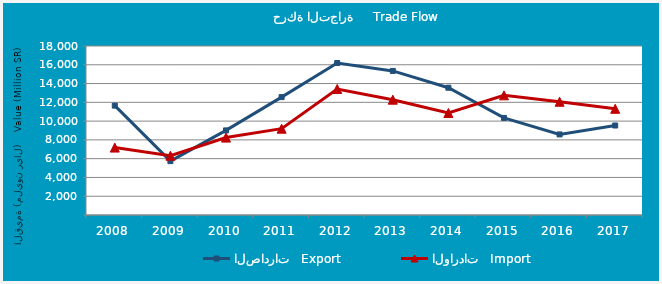
| Category | الصادرات   Export | الواردات   Import |
|---|---|---|
| 2008.0 | 11649575070 | 7180866508 |
| 2009.0 | 5737118504 | 6313540558 |
| 2010.0 | 9011629823 | 8245949708 |
| 2011.0 | 12555354226 | 9192315544 |
| 2012.0 | 16187192013 | 13422272232 |
| 2013.0 | 15346280897 | 12283000803 |
| 2014.0 | 13557544607 | 10866759327 |
| 2015.0 | 10338461364 | 12744513670 |
| 2016.0 | 8581679738 | 12063866251 |
| 2017.0 | 9532096890 | 11312339451 |